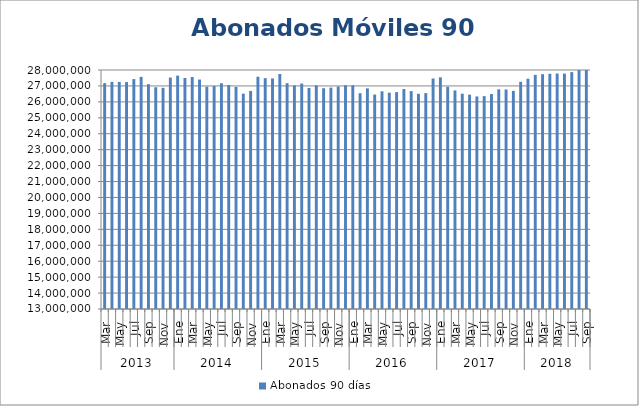
| Category | Abonados 90 días  |
|---|---|
| 0 | 27174429 |
| 1 | 27256799 |
| 2 | 27249896 |
| 3 | 27242396 |
| 4 | 27430194 |
| 5 | 27567464 |
| 6 | 27110010 |
| 7 | 26919316 |
| 8 | 26880609 |
| 9 | 27524963 |
| 10 | 27646717 |
| 11 | 27499992 |
| 12 | 27562088 |
| 13 | 27401040 |
| 14 | 26955717 |
| 15 | 26994609 |
| 16 | 27169188 |
| 17 | 27061687 |
| 18 | 26939071 |
| 19 | 26516500 |
| 20 | 26687326 |
| 21 | 27578143 |
| 22 | 27489223 |
| 23 | 27471553 |
| 24 | 27750473 |
| 25 | 27170692 |
| 26 | 27033211 |
| 27 | 27149172 |
| 28 | 26872979 |
| 29 | 27034173 |
| 30 | 26856662 |
| 31 | 26893632 |
| 32 | 26963755 |
| 33 | 27037951 |
| 34 | 27040824 |
| 35 | 26542149 |
| 36 | 26849710 |
| 37 | 26457447 |
| 38 | 26662676 |
| 39 | 26576782 |
| 40 | 26610099 |
| 41 | 26805521 |
| 42 | 26672717 |
| 43 | 26505805 |
| 44 | 26547173 |
| 45 | 27469211 |
| 46 | 27539556 |
| 47 | 26948853 |
| 48 | 26717067 |
| 49 | 26514588 |
| 50 | 26452370 |
| 51 | 26339907 |
| 52 | 26362130 |
| 53 | 26490787 |
| 54 | 26786764 |
| 55 | 26778405 |
| 56 | 26691976 |
| 57 | 27260107 |
| 58 | 27454349 |
| 59 | 27694179 |
| 60 | 27737550 |
| 61 | 27760296 |
| 62 | 27777818 |
| 63 | 27773600 |
| 64 | 27868225 |
| 65 | 28250702 |
| 66 | 28340717 |